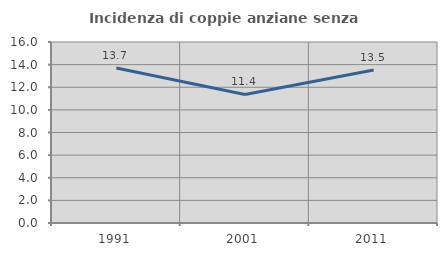
| Category | Incidenza di coppie anziane senza figli  |
|---|---|
| 1991.0 | 13.71 |
| 2001.0 | 11.364 |
| 2011.0 | 13.523 |